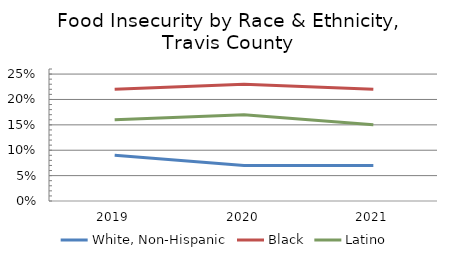
| Category | White, Non-Hispanic | Black | Latino |
|---|---|---|---|
| 2019.0 | 0.09 | 0.22 | 0.16 |
| 2020.0 | 0.07 | 0.23 | 0.17 |
| 2021.0 | 0.07 | 0.22 | 0.15 |